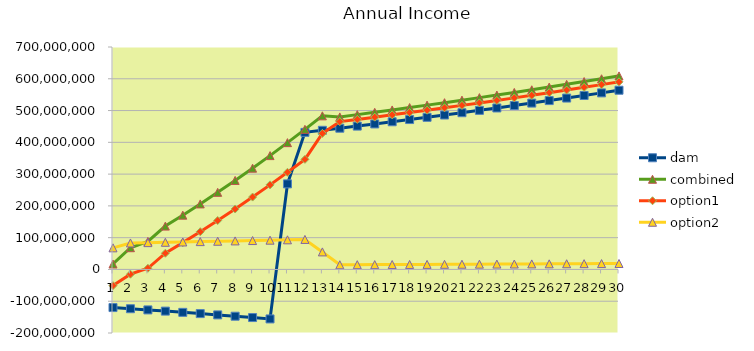
| Category | dam | combined | option1 | option2 |
|---|---|---|---|---|
| 0 | -120000000 | 17170000 | -50830000 | 68000000 |
| 1 | -123627000 | 68377791.603 | -14971250 | 83349041.603 |
| 2 | -127335810 | 88091585.965 | 3707244.363 | 84384341.603 |
| 3 | -131128068.225 | 136462707.285 | 51027536.182 | 85435171.103 |
| 4 | -135005443.639 | 170844609.641 | 84342846.596 | 86501763.045 |
| 5 | -138969636.501 | 206230488.993 | 118646135.126 | 87584353.867 |
| 6 | -143022378.924 | 242642728.722 | 153959545.171 | 88683183.551 |
| 7 | -147165435.451 | 280104157.818 | 190305662.138 | 89798495.68 |
| 8 | -151400603.638 | 318638059.207 | 227707521.715 | 90930537.491 |
| 9 | -155729714.649 | 358268178.236 | 266188618.307 | 92079559.929 |
| 10 | 269276583.047 | 399018731.307 | 305772913.603 | 93245817.704 |
| 11 | 431381392.161 | 440914414.665 | 346484845.319 | 94429569.346 |
| 12 | 437852113.044 | 483351840.348 | 428156845.291 | 55194995.056 |
| 13 | 444419894.739 | 479977466.305 | 465215329.42 | 14762136.885 |
| 14 | 451086193.16 | 487177128.3 | 472193559.362 | 14983568.938 |
| 15 | 457852486.058 | 494484785.224 | 479276462.752 | 15208322.472 |
| 16 | 464720273.349 | 501902057.003 | 486465609.693 | 15436447.309 |
| 17 | 471691077.449 | 509430587.858 | 493762593.839 | 15667994.019 |
| 18 | 478766443.611 | 517072046.676 | 501169032.746 | 15903013.929 |
| 19 | 485947940.265 | 524828127.376 | 508686568.237 | 16141559.138 |
| 20 | 493237159.369 | 532700549.286 | 516316866.761 | 16383682.525 |
| 21 | 500635716.759 | 540691057.526 | 524061619.762 | 16629437.763 |
| 22 | 508145252.511 | 548801423.389 | 531922544.059 | 16878879.33 |
| 23 | 515767431.298 | 557033444.739 | 539901382.22 | 17132062.52 |
| 24 | 523503942.768 | 565388946.411 | 547999902.953 | 17389043.458 |
| 25 | 531356501.909 | 573869780.607 | 556219901.497 | 17649879.109 |
| 26 | 539326849.438 | 582477827.316 | 564563200.02 | 17914627.296 |
| 27 | 547416752.18 | 591214994.725 | 573031648.02 | 18183346.705 |
| 28 | 555628003.462 | 600083219.646 | 581627122.74 | 18456096.906 |
| 29 | 563962423.514 | 609084467.941 | 590351529.581 | 18732938.36 |